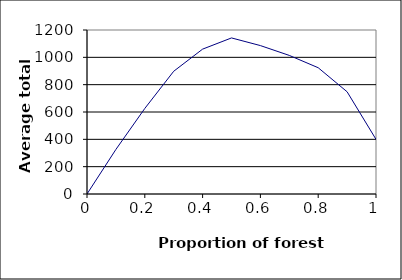
| Category | Series 0 |
|---|---|
| 1.0 | 400 |
| 0.9 | 748 |
| 0.8 | 924 |
| 0.7000000000000001 | 1014 |
| 0.6000000000000001 | 1086 |
| 0.5000000000000001 | 1142 |
| 0.40000000000000013 | 1060 |
| 0.30000000000000016 | 898 |
| 0.20000000000000015 | 626 |
| 0.10000000000000014 | 326 |
| 0.0 | 0 |